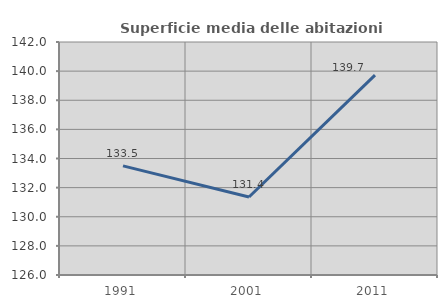
| Category | Superficie media delle abitazioni occupate |
|---|---|
| 1991.0 | 133.496 |
| 2001.0 | 131.357 |
| 2011.0 | 139.73 |